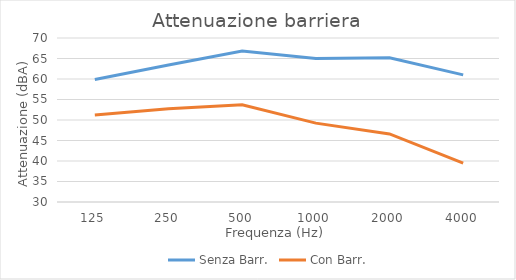
| Category | Senza Barr. | Con Barr. |
|---|---|---|
| 125.0 | 59.9 | 51.245 |
| 250.0 | 63.4 | 52.727 |
| 500.0 | 66.8 | 53.714 |
| 1000.0 | 65 | 49.237 |
| 2000.0 | 65.2 | 46.603 |
| 4000.0 | 61 | 39.483 |